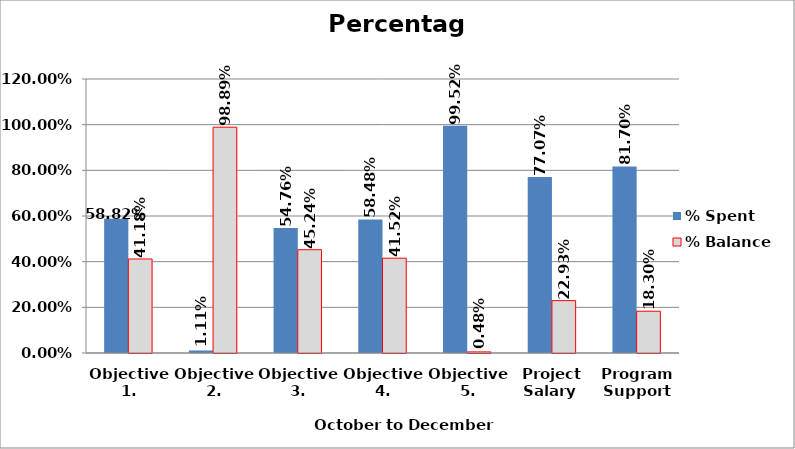
| Category | % Spent  | % Balance  |
|---|---|---|
| Objective 1. | 0.588 | 0.412 |
| Objective 2. | 0.011 | 0.989 |
| Objective 3. | 0.548 | 0.452 |
| Objective 4. | 0.585 | 0.415 |
| Objective 5. | 0.995 | 0.005 |
| Project Salary  | 0.771 | 0.229 |
| Program Support | 0.817 | 0.183 |